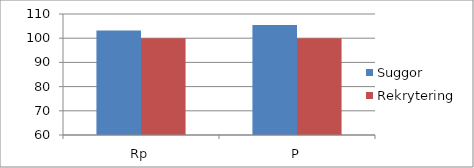
| Category | Suggor | Rekrytering |
|---|---|---|
| Rp | 103.226 | 100 |
| P | 105.405 | 100 |